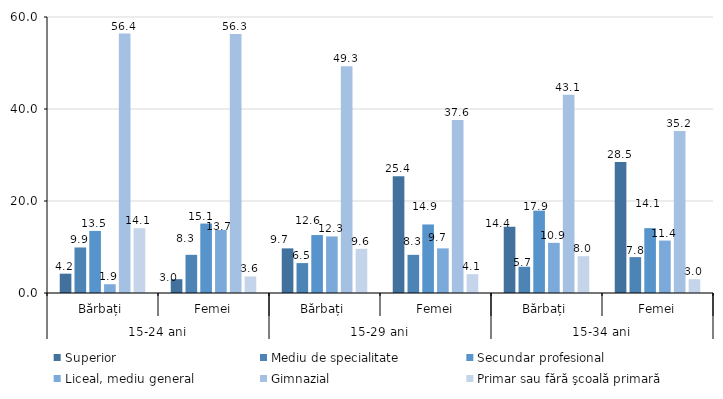
| Category | Superior | Mediu de specialitate | Secundar profesional | Liceal, mediu general | Gimnazial | Primar sau fără şcoală primară |
|---|---|---|---|---|---|---|
| 0 | 4.2 | 9.9 | 13.5 | 1.9 | 56.4 | 14.1 |
| 1 | 3 | 8.3 | 15.1 | 13.7 | 56.3 | 3.6 |
| 2 | 9.7 | 6.5 | 12.6 | 12.3 | 49.3 | 9.6 |
| 3 | 25.4 | 8.3 | 14.9 | 9.7 | 37.6 | 4.1 |
| 4 | 14.4 | 5.7 | 17.9 | 10.9 | 43.1 | 8 |
| 5 | 28.5 | 7.8 | 14.1 | 11.4 | 35.2 | 3 |